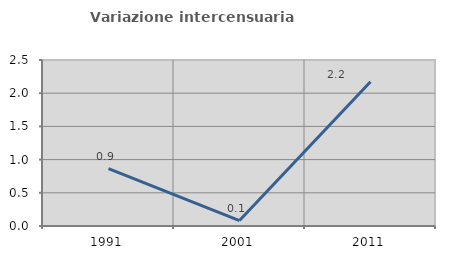
| Category | Variazione intercensuaria annua |
|---|---|
| 1991.0 | 0.864 |
| 2001.0 | 0.082 |
| 2011.0 | 2.173 |